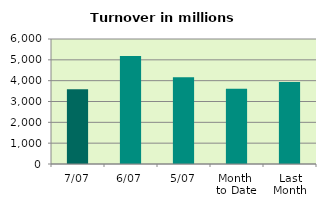
| Category | Series 0 |
|---|---|
| 7/07 | 3589.911 |
| 6/07 | 5179.554 |
| 5/07 | 4166.721 |
| Month 
to Date | 3611.745 |
| Last
Month | 3940.311 |